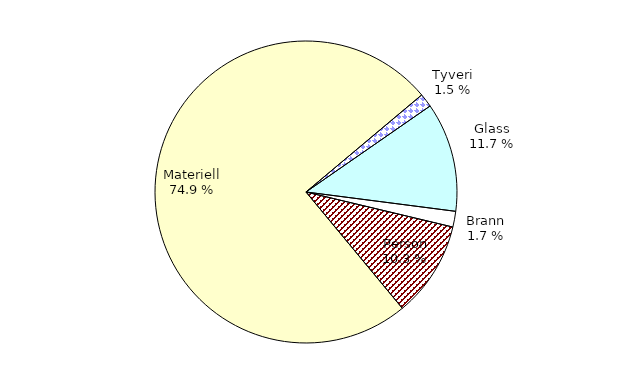
| Category | Series 0 |
|---|---|
| Tyveri | 152.228 |
| Glass | 1216.161 |
| Brann | 175.341 |
| Person | 1066.839 |
| Materiell | 7790.589 |